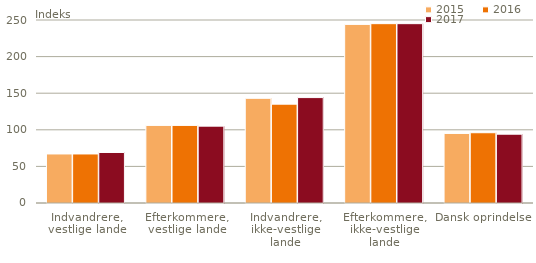
| Category | 2015 | 2016 | 2017 |
|---|---|---|---|
| Indvandrere,
vestlige lande | 67 | 67 | 69 |
| Efterkommere,
vestlige lande | 106 | 106 | 105 |
| Indvandrere,
ikke-vestlige lande | 143 | 135 | 144 |
| Efterkommere,
ikke-vestlige lande | 244 | 245 | 245 |
| Dansk oprindelse | 95 | 96 | 94 |